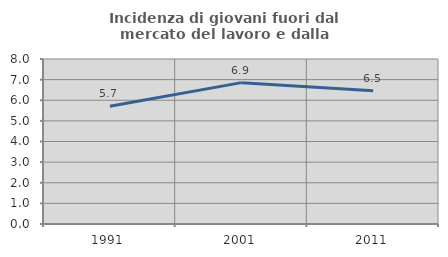
| Category | Incidenza di giovani fuori dal mercato del lavoro e dalla formazione  |
|---|---|
| 1991.0 | 5.706 |
| 2001.0 | 6.854 |
| 2011.0 | 6.464 |